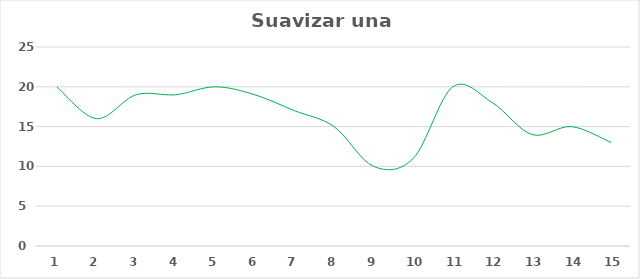
| Category | Serie A |
|---|---|
| 0 | 20 |
| 1 | 16 |
| 2 | 19 |
| 3 | 19 |
| 4 | 20 |
| 5 | 19 |
| 6 | 17 |
| 7 | 15 |
| 8 | 10 |
| 9 | 11 |
| 10 | 20 |
| 11 | 18 |
| 12 | 14 |
| 13 | 15 |
| 14 | 13 |